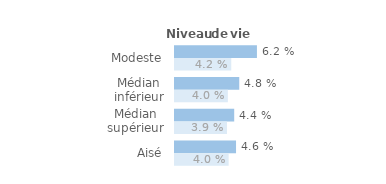
| Category | Series 1 | Series 0 |
|---|---|---|
| Modeste | 0.062 | 0.042 |
| Médian inférieur | 0.048 | 0.04 |
| Médian supérieur | 0.044 | 0.039 |
| Aisé | 0.046 | 0.04 |